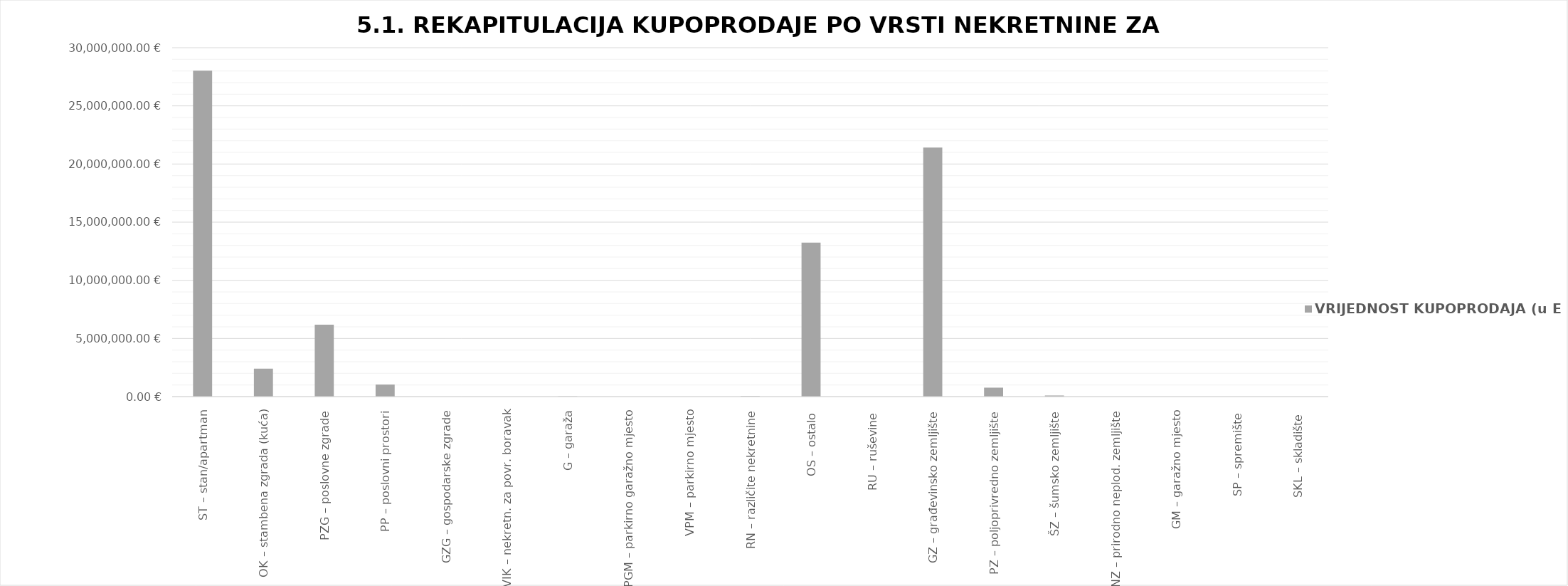
| Category | VRIJEDNOST KUPOPRODAJA (u EUR) |
|---|---|
| ST – stan/apartman | 28028546.943 |
| OK – stambena zgrada (kuća) | 2408866.379 |
| PZG – poslovne zgrade | 6183445.689 |
| PP – poslovni prostori | 1036213.045 |
| GZG – gospodarske zgrade | 0 |
| VIK – nekretn. za povr. boravak | 0 |
| G – garaža | 20180.649 |
| PGM – parkirno garažno mjesto | 0 |
| VPM – parkirno mjesto | 0 |
| RN – različite nekretnine | 39970.621 |
| OS – ostalo  | 13234190.949 |
| RU – ruševine  | 0 |
| GZ – građevinsko zemljište | 21408405.932 |
| PZ – poljoprivredno zemljište | 768510.731 |
| ŠZ – šumsko zemljište | 94382.805 |
| PNZ – prirodno neplod. zemljište | 0 |
| GM – garažno mjesto | 0 |
| SP – spremište  | 0 |
| SKL – skladište  | 0 |